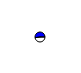
| Category | Series 0 |
|---|---|
| 0 | 747249 |
| 1 | 814502 |